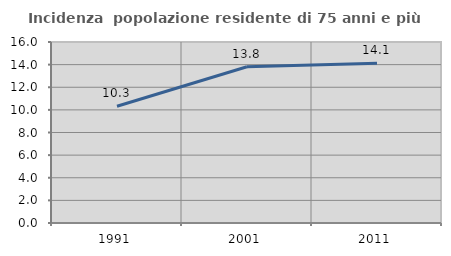
| Category | Incidenza  popolazione residente di 75 anni e più |
|---|---|
| 1991.0 | 10.317 |
| 2001.0 | 13.809 |
| 2011.0 | 14.121 |